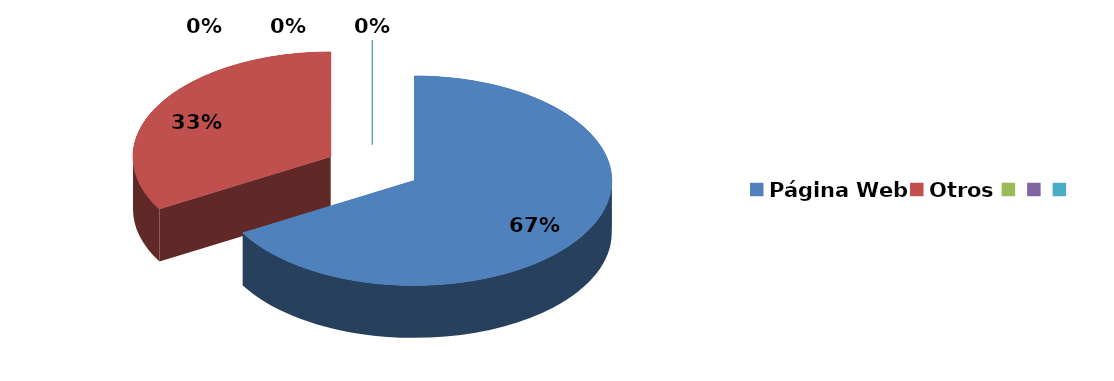
| Category | Series 0 |
|---|---|
| Página Web | 2 |
| Otros | 1 |